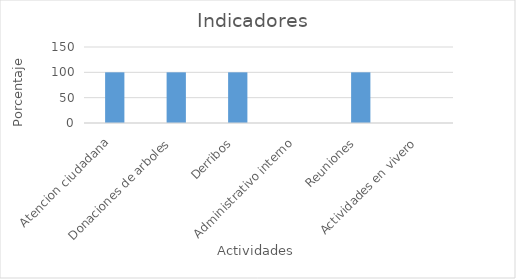
| Category | porcentaje  |
|---|---|
| Atencion ciudadana  | 100 |
| Donaciones de arboles  | 100 |
| Derribos  | 100 |
| Administrativo interno  | 0 |
| Reuniones  | 100 |
| Actividades en vivero  | 0 |